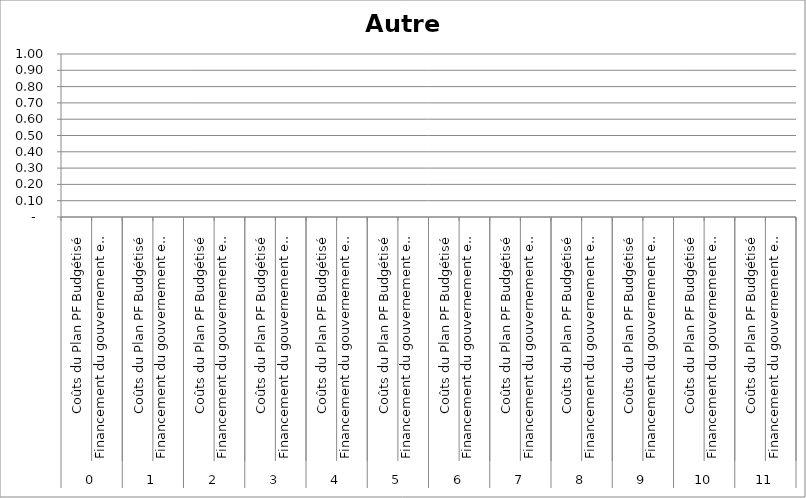
| Category | Autre 7 |
|---|---|
| 0 | 0 |
| 1 | 0 |
| 2 | 0 |
| 3 | 0 |
| 4 | 0 |
| 5 | 0 |
| 6 | 0 |
| 7 | 0 |
| 8 | 0 |
| 9 | 0 |
| 10 | 0 |
| 11 | 0 |
| 12 | 0 |
| 13 | 0 |
| 14 | 0 |
| 15 | 0 |
| 16 | 0 |
| 17 | 0 |
| 18 | 0 |
| 19 | 0 |
| 20 | 0 |
| 21 | 0 |
| 22 | 0 |
| 23 | 0 |